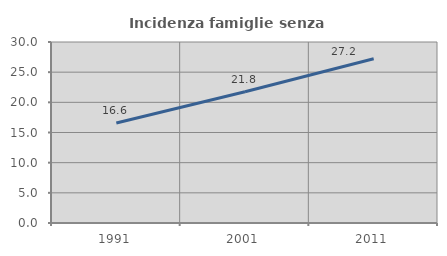
| Category | Incidenza famiglie senza nuclei |
|---|---|
| 1991.0 | 16.571 |
| 2001.0 | 21.755 |
| 2011.0 | 27.225 |